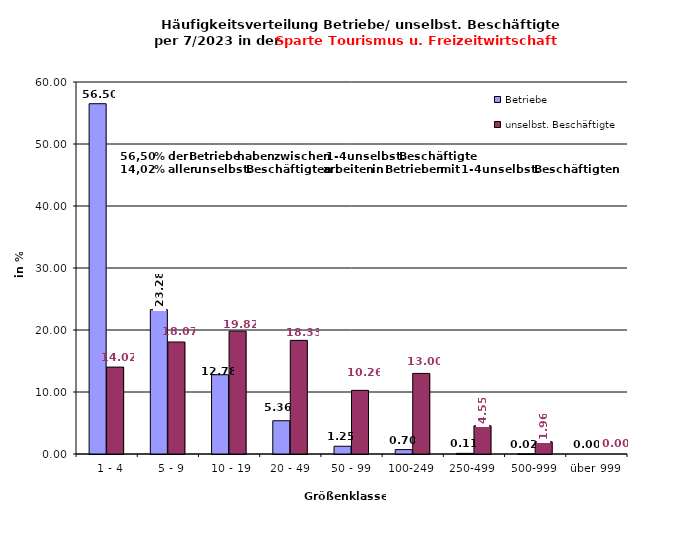
| Category | Betriebe | unselbst. Beschäftigte |
|---|---|---|
|   1 - 4 | 56.497 | 14.015 |
|   5 - 9 | 23.281 | 18.066 |
|  10 - 19 | 12.784 | 19.816 |
| 20 - 49 | 5.363 | 18.331 |
| 50 - 99 | 1.248 | 10.264 |
| 100-249 | 0.703 | 12.998 |
| 250-499 | 0.106 | 4.549 |
| 500-999 | 0.018 | 1.962 |
| über 999 | 0 | 0 |